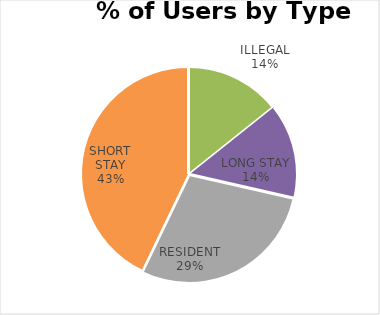
| Category | MANNING PLACE |
|---|---|
| COMMUTER | 0 |
| ILLEGAL | 1 |
| LONG STAY | 1 |
| RESIDENT | 2 |
| SHORT STAY | 3 |
| DISABLED | 0 |
| OTHER | 0 |